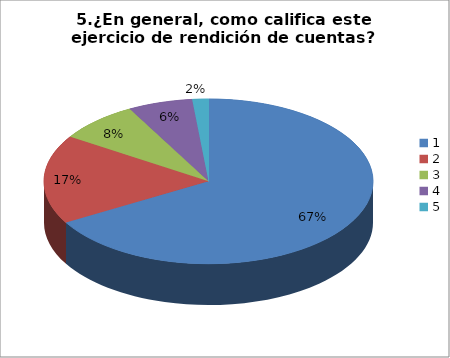
| Category | Series 0 |
|---|---|
| 0 | 42 |
| 1 | 11 |
| 2 | 5 |
| 3 | 4 |
| 4 | 1 |